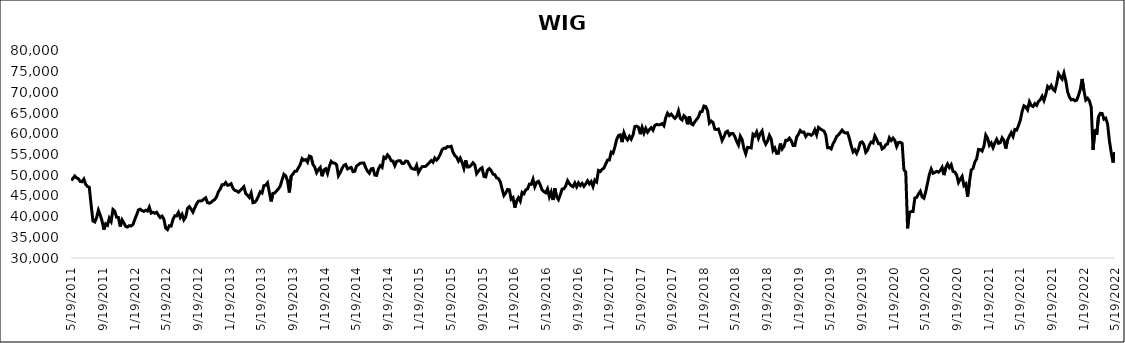
| Category | WIG |
|---|---|
| 5/19/11 | 48747.55 |
| 5/26/11 | 49215.53 |
| 6/2/11 | 49824.93 |
| 6/9/11 | 49378.82 |
| 6/16/11 | 49129.21 |
| 6/23/11 | 48485.26 |
| 6/30/11 | 48414.36 |
| 7/7/11 | 49057.05 |
| 7/14/11 | 47768.38 |
| 7/21/11 | 47291.31 |
| 7/28/11 | 47071.4 |
| 8/4/11 | 42828.22 |
| 8/11/11 | 38934.71 |
| 8/18/11 | 38697.56 |
| 8/25/11 | 39715.27 |
| 9/1/11 | 41553.09 |
| 9/8/11 | 40405.17 |
| 9/15/11 | 38945 |
| 9/22/11 | 36851.2 |
| 9/29/11 | 38264.32 |
| 10/6/11 | 37915.03 |
| 10/13/11 | 39608.13 |
| 10/20/11 | 38835.92 |
| 10/27/11 | 41708.88 |
| 11/3/11 | 41313.92 |
| 11/10/11 | 39853.18 |
| 11/17/11 | 39797.19 |
| 11/24/11 | 37607.27 |
| 12/1/11 | 39215.21 |
| 12/8/11 | 38474.28 |
| 12/15/11 | 37637.47 |
| 12/22/11 | 37478.7 |
| 12/29/11 | 37814.52 |
| 1/5/12 | 37739.39 |
| 1/12/12 | 38062.87 |
| 1/19/12 | 39288.13 |
| 1/26/12 | 40392.48 |
| 2/2/12 | 41602.24 |
| 2/9/12 | 41792.46 |
| 2/16/12 | 41430.3 |
| 2/23/12 | 41258.14 |
| 3/1/12 | 41533.87 |
| 3/8/12 | 41337.97 |
| 3/15/12 | 42281.33 |
| 3/22/12 | 40834.43 |
| 3/29/12 | 41028.06 |
| 4/5/12 | 40802.41 |
| 4/12/12 | 41053.82 |
| 4/19/12 | 40354.53 |
| 4/26/12 | 39761.78 |
| 5/3/12 | 40114.73 |
| 5/10/12 | 39404.16 |
| 5/17/12 | 37228.88 |
| 5/24/12 | 36852.75 |
| 5/31/12 | 37793.58 |
| 6/7/12 | 37707.25 |
| 6/14/12 | 39286.64 |
| 6/21/12 | 40207.61 |
| 6/28/12 | 40165.34 |
| 7/5/12 | 41013.96 |
| 7/12/12 | 39778.1 |
| 7/19/12 | 40545.64 |
| 7/26/12 | 39213.05 |
| 8/2/12 | 39876.95 |
| 8/9/12 | 41976.63 |
| 8/16/12 | 42408.41 |
| 8/23/12 | 41795.63 |
| 8/30/12 | 41077.44 |
| 9/6/12 | 42134.93 |
| 9/13/12 | 43047.41 |
| 9/20/12 | 43737.02 |
| 9/27/12 | 43763.3 |
| 10/4/12 | 43840.23 |
| 10/11/12 | 44224.67 |
| 10/18/12 | 44550.12 |
| 10/25/12 | 43374.6 |
| 11/1/12 | 43232.44 |
| 11/8/12 | 43429.42 |
| 11/15/12 | 43845.94 |
| 11/22/12 | 44121.53 |
| 11/29/12 | 44787.84 |
| 12/6/12 | 46019.97 |
| 12/13/12 | 46653.84 |
| 12/20/12 | 47701.82 |
| 12/27/12 | 47673.03 |
| 1/3/13 | 48222.72 |
| 1/10/13 | 47546.91 |
| 1/17/13 | 47661.37 |
| 1/24/13 | 47942.04 |
| 1/31/13 | 46840.15 |
| 2/7/13 | 46329.66 |
| 2/14/13 | 46211.54 |
| 2/21/13 | 45879.9 |
| 2/28/13 | 46280.36 |
| 3/7/13 | 46745.26 |
| 3/14/13 | 47223.68 |
| 3/21/13 | 45580.47 |
| 3/28/13 | 45147.57 |
| 4/4/13 | 44623.89 |
| 4/11/13 | 45688.48 |
| 4/18/13 | 43364.7 |
| 4/25/13 | 43482.18 |
| 5/2/13 | 43991.51 |
| 5/9/13 | 44943.16 |
| 5/16/13 | 45992.03 |
| 5/23/13 | 45687.76 |
| 5/30/13 | 47476.64 |
| 6/6/13 | 47573.66 |
| 6/13/13 | 48152.82 |
| 6/20/13 | 45870 |
| 6/27/13 | 43667.37 |
| 7/4/13 | 45613.75 |
| 7/11/13 | 45712.72 |
| 7/18/13 | 46221.23 |
| 7/25/13 | 46713.02 |
| 8/1/13 | 47370.81 |
| 8/8/13 | 48862.88 |
| 8/15/13 | 50223.95 |
| 8/22/13 | 49846.48 |
| 8/29/13 | 48676.45 |
| 9/5/13 | 45830.66 |
| 9/12/13 | 49771.55 |
| 9/19/13 | 50300.53 |
| 9/26/13 | 50936.34 |
| 10/3/13 | 50982.03 |
| 10/10/13 | 51806.83 |
| 10/17/13 | 52573.59 |
| 10/24/13 | 53994.46 |
| 10/31/13 | 53607.86 |
| 11/7/13 | 53785.07 |
| 11/14/13 | 53127.16 |
| 11/21/13 | 54621.21 |
| 11/28/13 | 54420.19 |
| 12/5/13 | 52597.13 |
| 12/12/13 | 51947.96 |
| 12/19/13 | 50631.75 |
| 12/26/13 | 51362.3 |
| 1/2/14 | 51865.89 |
| 1/9/14 | 49753.03 |
| 1/16/14 | 51288.7 |
| 1/23/14 | 51569.21 |
| 1/30/14 | 50417.17 |
| 2/6/14 | 52138.87 |
| 2/13/14 | 53349.65 |
| 2/20/14 | 52967.02 |
| 2/27/14 | 52906.04 |
| 3/6/14 | 52487.84 |
| 3/13/14 | 49878.65 |
| 3/20/14 | 50627.71 |
| 3/27/14 | 51642.99 |
| 4/3/14 | 52376.18 |
| 4/10/14 | 52580.73 |
| 4/17/14 | 51510.98 |
| 4/24/14 | 51705.76 |
| 5/1/14 | 51892.77 |
| 5/8/14 | 50851.25 |
| 5/15/14 | 50944.5 |
| 5/22/14 | 52244.13 |
| 5/29/14 | 52553.48 |
| 6/5/14 | 52901.29 |
| 6/12/14 | 52927.91 |
| 6/19/14 | 52937.45 |
| 6/26/14 | 51815.43 |
| 7/3/14 | 50951.73 |
| 7/10/14 | 50474.36 |
| 7/17/14 | 51527.37 |
| 7/24/14 | 51613.47 |
| 7/31/14 | 50037.12 |
| 8/7/14 | 49958.67 |
| 8/14/14 | 51512.57 |
| 8/21/14 | 52294.93 |
| 8/28/14 | 51882.01 |
| 9/4/14 | 54358.49 |
| 9/11/14 | 54065.27 |
| 9/18/14 | 54906.1 |
| 9/25/14 | 54411.77 |
| 10/2/14 | 53498.77 |
| 10/9/14 | 53416.03 |
| 10/16/14 | 52297.79 |
| 10/23/14 | 53335.43 |
| 10/30/14 | 53492 |
| 11/6/14 | 53512.14 |
| 11/13/14 | 52816.35 |
| 11/20/14 | 52848.54 |
| 11/27/14 | 53415.63 |
| 12/4/14 | 53346.86 |
| 12/11/14 | 52550.03 |
| 12/18/14 | 51739.04 |
| 12/25/14 | 51511.68 |
| 1/1/15 | 51416.08 |
| 1/8/15 | 52391 |
| 1/15/15 | 50616.63 |
| 1/22/15 | 51484.81 |
| 1/29/15 | 52040.24 |
| 2/5/15 | 52107.26 |
| 2/12/15 | 52139.81 |
| 2/19/15 | 52572.95 |
| 2/26/15 | 53042.6 |
| 3/5/15 | 53546.4 |
| 3/12/15 | 53136.13 |
| 3/19/15 | 54148.48 |
| 3/26/15 | 53649.9 |
| 4/2/15 | 54179.04 |
| 4/9/15 | 55063.85 |
| 4/16/15 | 56165.1 |
| 4/23/15 | 56492.95 |
| 4/30/15 | 56477.69 |
| 5/7/15 | 56911.34 |
| 5/14/15 | 56845.83 |
| 5/21/15 | 56990.6 |
| 5/28/15 | 55556.13 |
| 6/4/15 | 54749.74 |
| 6/11/15 | 54357.69 |
| 6/18/15 | 53408.53 |
| 6/25/15 | 54141.2 |
| 7/2/15 | 53074.71 |
| 7/9/15 | 51658.71 |
| 7/16/15 | 53588.24 |
| 7/23/15 | 51986.22 |
| 7/30/15 | 52011.81 |
| 8/6/15 | 52418.07 |
| 8/13/15 | 52995.96 |
| 8/20/15 | 52508.32 |
| 8/27/15 | 50366.09 |
| 9/3/15 | 50977.06 |
| 9/10/15 | 51527.08 |
| 9/17/15 | 51801.58 |
| 9/24/15 | 49701.31 |
| 10/1/15 | 49593.95 |
| 10/8/15 | 51222.77 |
| 10/15/15 | 51599.62 |
| 10/22/15 | 51094.29 |
| 10/29/15 | 50262.68 |
| 11/5/15 | 50125.85 |
| 11/12/15 | 49358.2 |
| 11/19/15 | 49177.74 |
| 11/26/15 | 48418.14 |
| 12/3/15 | 46693.09 |
| 12/10/15 | 45093.65 |
| 12/17/15 | 45684.05 |
| 12/24/15 | 46564.08 |
| 12/31/15 | 46467.38 |
| 1/7/16 | 44195.91 |
| 1/14/16 | 44596.08 |
| 1/21/16 | 42180.3 |
| 1/28/16 | 43778.96 |
| 2/4/16 | 44557.64 |
| 2/11/16 | 43741.96 |
| 2/18/16 | 45834.88 |
| 2/25/16 | 45497.77 |
| 3/3/16 | 46448.27 |
| 3/10/16 | 46686.74 |
| 3/17/16 | 47833.39 |
| 3/24/16 | 47778.01 |
| 3/31/16 | 49017.35 |
| 4/7/16 | 47231.36 |
| 4/14/16 | 48285.21 |
| 4/21/16 | 48514.39 |
| 4/28/16 | 47643.7 |
| 5/5/16 | 46430.16 |
| 5/12/16 | 46022.02 |
| 5/19/16 | 45751.68 |
| 5/26/16 | 46695.37 |
| 6/2/16 | 44772.72 |
| 6/9/16 | 45940.12 |
| 6/16/16 | 44007.81 |
| 6/23/16 | 46826.85 |
| 6/30/16 | 44748.53 |
| 7/7/16 | 44077.16 |
| 7/14/16 | 45246.26 |
| 7/21/16 | 46639.17 |
| 7/28/16 | 46718.98 |
| 8/4/16 | 47407.09 |
| 8/11/16 | 48675.96 |
| 8/18/16 | 47967.07 |
| 8/25/16 | 47464.07 |
| 9/1/16 | 47221.32 |
| 9/8/16 | 48129.15 |
| 9/15/16 | 47198.39 |
| 9/22/16 | 48154.88 |
| 9/29/16 | 47494.62 |
| 10/6/16 | 48014.44 |
| 10/13/16 | 47303.15 |
| 10/20/16 | 47894.17 |
| 10/27/16 | 48651.28 |
| 11/3/16 | 47899.61 |
| 11/10/16 | 48447.59 |
| 11/17/16 | 47274.21 |
| 11/24/16 | 48824.83 |
| 12/1/16 | 48404.21 |
| 12/8/16 | 51123.43 |
| 12/15/16 | 50881.35 |
| 12/22/16 | 51423.71 |
| 12/29/16 | 51703.91 |
| 1/5/17 | 52721.67 |
| 1/12/17 | 53650.94 |
| 1/19/17 | 53654.99 |
| 1/26/17 | 55560.23 |
| 2/2/17 | 55303.11 |
| 2/9/17 | 56785.52 |
| 2/16/17 | 58610.28 |
| 2/23/17 | 59583.89 |
| 3/2/17 | 59743.64 |
| 3/9/17 | 57986.6 |
| 3/16/17 | 60247.18 |
| 3/23/17 | 59093.68 |
| 3/30/17 | 58527.2 |
| 4/6/17 | 59406.36 |
| 4/13/17 | 58695.36 |
| 4/20/17 | 59700.07 |
| 4/27/17 | 61731.8 |
| 5/4/17 | 61862.8 |
| 5/11/17 | 61598.78 |
| 5/18/17 | 59901.12 |
| 5/25/17 | 61536.22 |
| 6/1/17 | 60181.96 |
| 6/8/17 | 61312.68 |
| 6/15/17 | 60381.07 |
| 6/22/17 | 60987.33 |
| 6/29/17 | 61475.96 |
| 7/6/17 | 60869.83 |
| 7/13/17 | 62018.68 |
| 7/20/17 | 62269.72 |
| 7/27/17 | 62171.7 |
| 8/3/17 | 62231.08 |
| 8/10/17 | 62451.57 |
| 8/17/17 | 61949.4 |
| 8/24/17 | 63886.54 |
| 8/31/17 | 64973.76 |
| 9/7/17 | 64381.87 |
| 9/14/17 | 64748.47 |
| 9/21/17 | 64209.19 |
| 9/28/17 | 63729.77 |
| 10/5/17 | 64185.71 |
| 10/12/17 | 65529.1 |
| 10/19/17 | 63745 |
| 10/26/17 | 63342.71 |
| 11/2/17 | 64375.83 |
| 11/9/17 | 63923.62 |
| 11/16/17 | 62299.29 |
| 11/23/17 | 64207.77 |
| 11/30/17 | 62440.31 |
| 12/7/17 | 62164.65 |
| 12/14/17 | 62916.39 |
| 12/21/17 | 63477.25 |
| 12/28/17 | 64053.47 |
| 1/4/18 | 65297.96 |
| 1/11/18 | 65379.88 |
| 1/18/18 | 66709.12 |
| 1/25/18 | 66561.79 |
| 2/1/18 | 65585.79 |
| 2/8/18 | 62604.89 |
| 2/15/18 | 63078.16 |
| 2/22/18 | 62717.27 |
| 3/1/18 | 61116.96 |
| 3/8/18 | 61036.99 |
| 3/15/18 | 61156.91 |
| 3/22/18 | 59862.55 |
| 3/29/18 | 58377.42 |
| 4/5/18 | 59244.04 |
| 4/12/18 | 60393.23 |
| 4/19/18 | 60629.81 |
| 4/26/18 | 59628.04 |
| 5/3/18 | 60066.46 |
| 5/10/18 | 60091.26 |
| 5/17/18 | 59337.27 |
| 5/24/18 | 58189.49 |
| 5/31/18 | 57282.73 |
| 6/7/18 | 59412.76 |
| 6/14/18 | 58603.93 |
| 6/21/18 | 56425.25 |
| 6/28/18 | 55169.77 |
| 7/5/18 | 56719.88 |
| 7/12/18 | 56671.44 |
| 7/19/18 | 56585.5 |
| 7/26/18 | 59871.2 |
| 8/2/18 | 59484.35 |
| 8/9/18 | 60455.75 |
| 8/16/18 | 58921.44 |
| 8/23/18 | 60044.45 |
| 8/30/18 | 60690.32 |
| 9/6/18 | 58469.6 |
| 9/13/18 | 57493.38 |
| 9/20/18 | 58231.57 |
| 9/27/18 | 59616.27 |
| 10/4/18 | 58736.08 |
| 10/11/18 | 55941.06 |
| 10/18/18 | 56560.93 |
| 10/25/18 | 55271.63 |
| 11/1/18 | 55312.71 |
| 11/8/18 | 57655.73 |
| 11/15/18 | 56329.01 |
| 11/22/18 | 56932.62 |
| 11/29/18 | 58412.94 |
| 12/6/18 | 58409.09 |
| 12/13/18 | 58952.55 |
| 12/20/18 | 58349.03 |
| 12/27/18 | 57183.28 |
| 1/3/19 | 57192.42 |
| 1/10/19 | 59219.23 |
| 1/17/19 | 59894.9 |
| 1/24/19 | 60791.02 |
| 1/31/19 | 60367.42 |
| 2/7/19 | 60422.38 |
| 2/14/19 | 59348.4 |
| 2/21/19 | 59938.07 |
| 2/28/19 | 59903.7 |
| 3/7/19 | 59638.3 |
| 3/14/19 | 60002.72 |
| 3/21/19 | 60976.51 |
| 3/28/19 | 59752.66 |
| 4/4/19 | 61533.27 |
| 4/11/19 | 61168.92 |
| 4/18/19 | 60910.11 |
| 4/25/19 | 60680.62 |
| 5/2/19 | 59744.3 |
| 5/9/19 | 56637.25 |
| 5/16/19 | 56664.5 |
| 5/23/19 | 56351.13 |
| 5/30/19 | 57566.83 |
| 6/6/19 | 58360.5 |
| 6/13/19 | 59374.38 |
| 6/20/19 | 59738.56 |
| 6/27/19 | 60293.37 |
| 7/4/19 | 60888.98 |
| 7/11/19 | 60362.11 |
| 7/18/19 | 60192.6 |
| 7/25/19 | 60249.72 |
| 8/1/19 | 58863.73 |
| 8/8/19 | 57102.69 |
| 8/15/19 | 55634.7 |
| 8/22/19 | 56118.92 |
| 8/29/19 | 55273.05 |
| 9/5/19 | 56358.3 |
| 9/12/19 | 57886.6 |
| 9/19/19 | 58053.03 |
| 9/26/19 | 57377.87 |
| 10/3/19 | 55523.06 |
| 10/10/19 | 56034.97 |
| 10/17/19 | 57297.12 |
| 10/24/19 | 58012.97 |
| 10/31/19 | 57783.02 |
| 11/7/19 | 59492.22 |
| 11/14/19 | 58622.1 |
| 11/21/19 | 57618.54 |
| 11/28/19 | 57669.94 |
| 12/5/19 | 56338.75 |
| 12/12/19 | 56621.06 |
| 12/19/19 | 57346.95 |
| 12/26/19 | 57569.71 |
| 1/2/20 | 59048.28 |
| 1/9/20 | 58397.17 |
| 1/16/20 | 58962.37 |
| 1/23/20 | 58401.85 |
| 1/30/20 | 56923.36 |
| 2/6/20 | 57900.04 |
| 2/13/20 | 57960.23 |
| 2/20/20 | 57693.12 |
| 2/27/20 | 51318.69 |
| 3/5/20 | 50753.91 |
| 3/12/20 | 37164.02 |
| 3/19/20 | 41041.92 |
| 3/26/20 | 41202.98 |
| 4/2/20 | 41219.51 |
| 4/9/20 | 44499.23 |
| 4/16/20 | 44645.12 |
| 4/23/20 | 45450.43 |
| 4/30/20 | 46117 |
| 5/7/20 | 44769.05 |
| 5/14/20 | 44450.71 |
| 5/21/20 | 46073.39 |
| 5/28/20 | 48144.34 |
| 6/4/20 | 50202.54 |
| 6/11/20 | 51486.94 |
| 6/18/20 | 50445.13 |
| 6/25/20 | 50658.89 |
| 7/2/20 | 50937.18 |
| 7/9/20 | 50726.22 |
| 7/16/20 | 51121.23 |
| 7/23/20 | 51890.42 |
| 7/30/20 | 50024.63 |
| 8/6/20 | 51816.87 |
| 8/13/20 | 52706.25 |
| 8/20/20 | 51842.65 |
| 8/27/20 | 52528.67 |
| 9/3/20 | 50915.67 |
| 9/10/20 | 50757.07 |
| 9/17/20 | 50035.54 |
| 9/24/20 | 48241.11 |
| 10/1/20 | 49035.41 |
| 10/8/20 | 49727.34 |
| 10/15/20 | 47482 |
| 10/22/20 | 47910.38 |
| 10/29/20 | 44840.6 |
| 11/5/20 | 48295.31 |
| 11/12/20 | 51229.23 |
| 11/19/20 | 51651.4 |
| 11/26/20 | 53187.31 |
| 12/3/20 | 53967.82 |
| 12/10/20 | 56230.4 |
| 12/17/20 | 56176.07 |
| 12/24/20 | 55843.46 |
| 12/31/20 | 57025.84 |
| 1/7/21 | 59687.54 |
| 1/14/21 | 58945.17 |
| 1/21/21 | 57226.74 |
| 1/28/21 | 57797.95 |
| 2/4/21 | 56669.86 |
| 2/11/21 | 57790.5 |
| 2/18/21 | 58684.46 |
| 2/25/21 | 57706.4 |
| 3/4/21 | 57869.71 |
| 3/11/21 | 59028.6 |
| 3/18/21 | 58405.96 |
| 3/25/21 | 56448.66 |
| 4/1/21 | 58512.71 |
| 4/8/21 | 59435.58 |
| 4/15/21 | 60279.93 |
| 4/22/21 | 59376.35 |
| 4/29/21 | 61043.33 |
| 5/6/21 | 60898.92 |
| 5/13/21 | 62004.52 |
| 5/20/21 | 63262.41 |
| 5/27/21 | 65400.51 |
| 6/3/21 | 66757.97 |
| 6/10/21 | 66507.19 |
| 6/17/21 | 65806.48 |
| 6/24/21 | 67745.39 |
| 7/1/21 | 66836.25 |
| 7/8/21 | 66598.05 |
| 7/15/21 | 67292.59 |
| 7/22/21 | 66882.41 |
| 7/29/21 | 67833.05 |
| 8/5/21 | 68256.77 |
| 8/12/21 | 69076.8 |
| 8/19/21 | 68035.61 |
| 8/26/21 | 69454.99 |
| 9/2/21 | 71431.16 |
| 9/9/21 | 70980.21 |
| 9/16/21 | 71674.66 |
| 9/23/21 | 70725.53 |
| 9/30/21 | 70340.86 |
| 10/7/21 | 72124.89 |
| 10/14/21 | 74524.78 |
| 10/21/21 | 73818.53 |
| 10/28/21 | 73217 |
| 11/4/21 | 74659.51 |
| 11/11/21 | 72794.96 |
| 11/18/21 | 70145.47 |
| 11/25/21 | 68860.62 |
| 12/2/21 | 68203.86 |
| 12/9/21 | 68326.8 |
| 12/16/21 | 67984.08 |
| 12/23/21 | 68120.16 |
| 12/30/21 | 69296.26 |
| 1/6/22 | 70750.99 |
| 1/13/22 | 73245.28 |
| 1/20/22 | 70419.86 |
| 1/27/22 | 68131.21 |
| 2/3/22 | 68551 |
| 2/10/22 | 67939.86 |
| 2/17/22 | 66409.08 |
| 2/24/22 | 56086.65 |
| 3/3/22 | 61010.19 |
| 3/10/22 | 59796.72 |
| 3/17/22 | 64133.07 |
| 3/24/22 | 64948.68 |
| 3/31/22 | 64900.36 |
| 4/7/22 | 63524.54 |
| 4/14/22 | 63760.06 |
| 4/21/22 | 62331.7 |
| 4/28/22 | 58300.98 |
| 5/5/22 | 55467.4 |
| 5/12/22 | 53074.58 |
| 5/19/22 | 55555.31 |